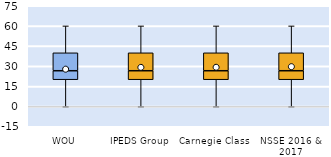
| Category | 25th | 50th | 75th |
|---|---|---|---|
| WOU | 20 | 6.667 | 13.333 |
| IPEDS Group | 20 | 6.667 | 13.333 |
| Carnegie Class | 20 | 6.667 | 13.333 |
| NSSE 2016 & 2017 | 20 | 6.667 | 13.333 |